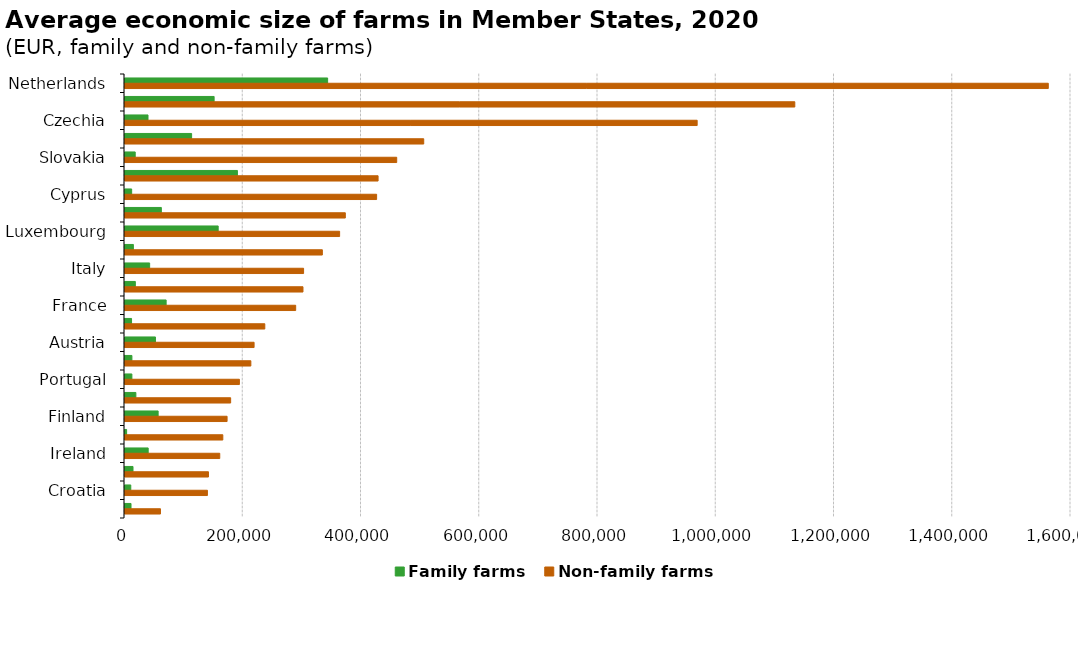
| Category | Family farms | Non-family farms |
|---|---|---|
| Netherlands | 342714.704 | 1561584.111 |
| Denmark | 150725.95 | 1132871.666 |
| Czechia | 38917.607 | 967710.8 |
| Germany | 112671.013 | 505253.552 |
| Slovakia | 17268.945 | 459554.361 |
| Belgium | 190141.632 | 428045.243 |
| Cyprus | 11283.76 | 425575.805 |
| Sweden | 61471.256 | 372636.383 |
| Luxembourg | 157590.011 | 362995.509 |
| Hungary | 14176.269 | 333780.782 |
| Italy | 41684.529 | 302042.288 |
| Poland | 17482.999 | 301017.132 |
| France | 69572.801 | 288669.26 |
| Bulgaria | 11092.583 | 236461.188 |
| Austria | 51515.545 | 218328.169 |
| Latvia | 11694.194 | 212857.804 |
| Portugal | 11632.838 | 193493.399 |
| Estonia | 18375.776 | 178689.809 |
| Finland | 56044.356 | 172654.419 |
| Romania | 2746.921 | 165455.997 |
| Ireland | 39206.299 | 160279.576 |
| Greece | 13547.787 | 141156.685 |
| Croatia | 9754.94 | 139380.979 |
| Malta | 10199.368 | 60005.751 |